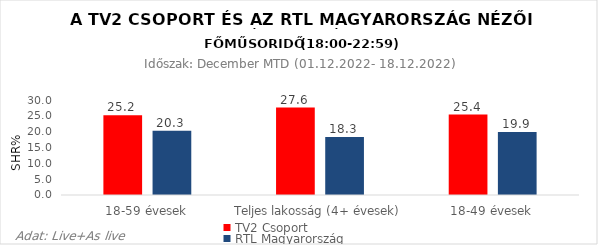
| Category | TV2 Csoport | RTL Magyarország |
|---|---|---|
| 18-59 évesek | 25.2 | 20.3 |
| Teljes lakosság (4+ évesek) | 27.6 | 18.3 |
| 18-49 évesek | 25.4 | 19.9 |